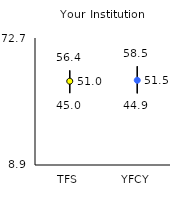
| Category | 25th | 75th | Mean |
|---|---|---|---|
| TFS | 45 | 56.4 | 51 |
| YFCY | 44.9 | 58.5 | 51.46 |